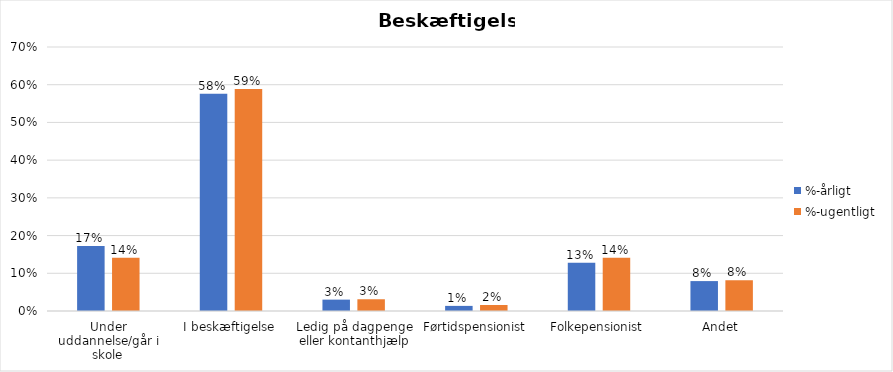
| Category | %-årligt | %-ugentligt |
|---|---|---|
| Under uddannelse/går i skole | 0.173 | 0.141 |
| I beskæftigelse | 0.576 | 0.589 |
| Ledig på dagpenge eller kontanthjælp | 0.03 | 0.031 |
| Førtidspensionist | 0.014 | 0.016 |
| Folkepensionist | 0.128 | 0.141 |
| Andet | 0.079 | 0.082 |